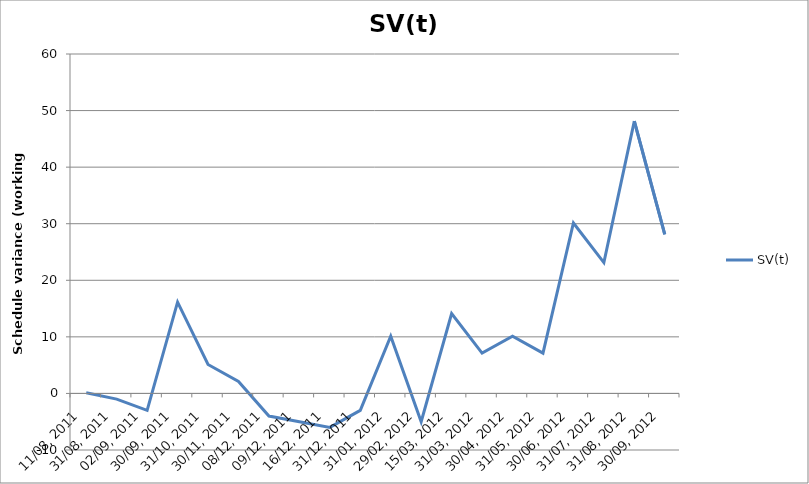
| Category | SV(t) |
|---|---|
| 11/08, 2011 | 0.125 |
| 31/08, 2011 | -1 |
| 02/09, 2011 | -3 |
| 30/09, 2011 | 16.125 |
| 31/10, 2011 | 5.125 |
| 30/11, 2011 | 2.125 |
| 08/12, 2011 | -4 |
| 09/12, 2011 | -5 |
| 16/12, 2011 | -6 |
| 31/12, 2011 | -3 |
| 31/01, 2012 | 10.125 |
| 29/02, 2012 | -5 |
| 15/03, 2012 | 14.125 |
| 31/03, 2012 | 7.125 |
| 30/04, 2012 | 10.125 |
| 31/05, 2012 | 7.125 |
| 30/06, 2012 | 30.125 |
| 31/07, 2012 | 23.125 |
| 31/08, 2012 | 48.125 |
| 30/09, 2012 | 28.125 |